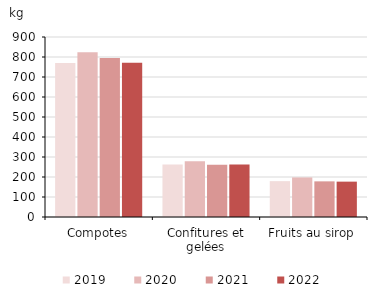
| Category | 2019 | 2020 | 2021 | 2022 |
|---|---|---|---|---|
| Compotes | 770.5 | 824.3 | 795.5 | 771.6 |
| Confitures et gelées | 262.4 | 279 | 261.1 | 262.1 |
| Fruits au sirop | 179.3 | 197.8 | 178.2 | 176.8 |